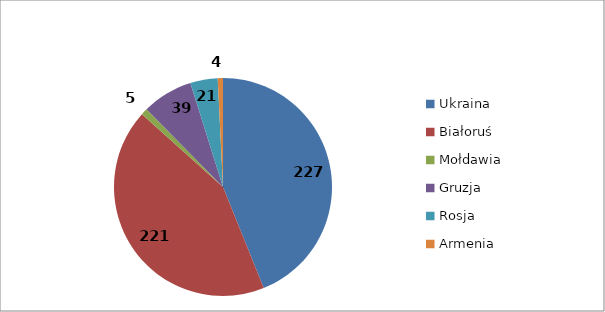
| Category | Series 0 |
|---|---|
| Ukraina | 227 |
| Białoruś | 221 |
| Mołdawia | 5 |
| Gruzja | 39 |
| Rosja | 21 |
| Armenia | 4 |